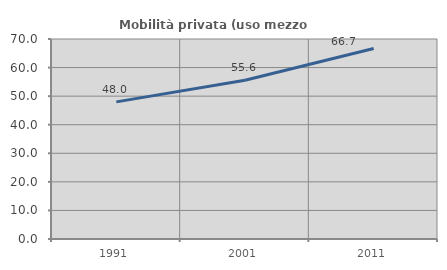
| Category | Mobilità privata (uso mezzo privato) |
|---|---|
| 1991.0 | 48 |
| 2001.0 | 55.556 |
| 2011.0 | 66.667 |